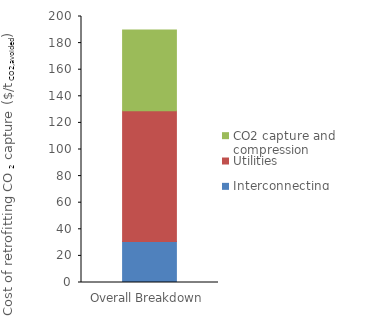
| Category | Interconnecting | Utilities | CO2 capture and compression |
|---|---|---|---|
| 0 | 30.906 | 98.181 | 60.729 |